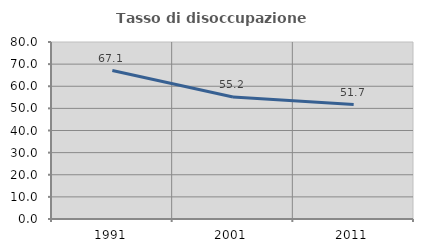
| Category | Tasso di disoccupazione giovanile  |
|---|---|
| 1991.0 | 67.095 |
| 2001.0 | 55.155 |
| 2011.0 | 51.736 |